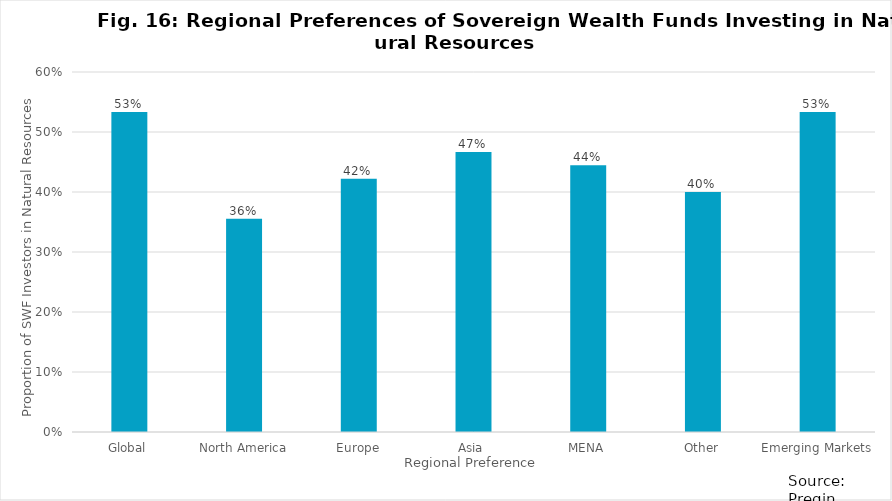
| Category | Series 0 |
|---|---|
| Global | 0.533 |
| North America | 0.356 |
| Europe | 0.422 |
| Asia | 0.467 |
| MENA | 0.444 |
| Other | 0.4 |
| Emerging Markets | 0.533 |